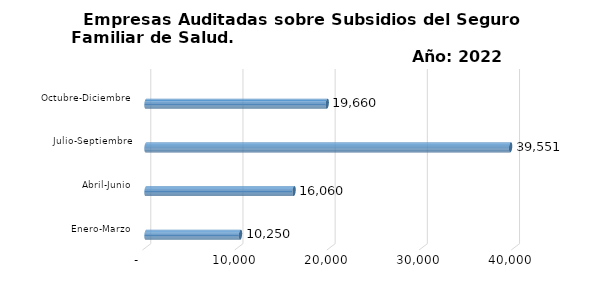
| Category | Empresas Auditadas/1 | Series 1 | Series 2 |
|---|---|---|---|
| Enero-Marzo | 10250 |  |  |
| Abril-Junio | 16060 |  |  |
| Julio-Septiembre | 39551 |  |  |
| Octubre-Diciembre | 19660 |  |  |